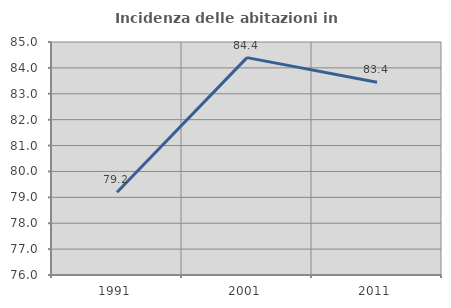
| Category | Incidenza delle abitazioni in proprietà  |
|---|---|
| 1991.0 | 79.197 |
| 2001.0 | 84.397 |
| 2011.0 | 83.448 |